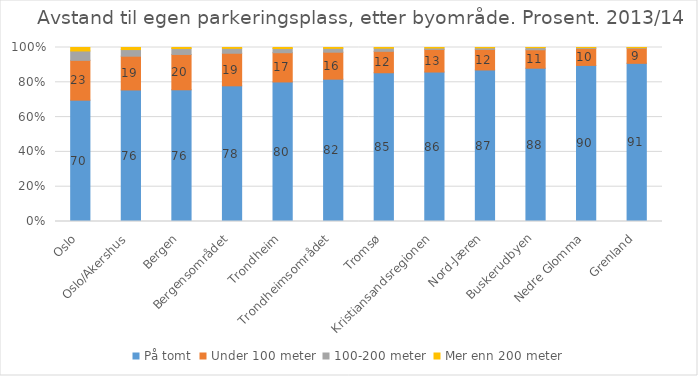
| Category | På tomt | Under 100 meter | 100-200 meter | Mer enn 200 meter |
|---|---|---|---|---|
| Oslo | 69.8 | 22.9 | 5.4 | 2 |
| Oslo/Akershus | 75.6 | 19.4 | 3.8 | 1.2 |
| Bergen | 75.7 | 20.3 | 3.4 | 0.6 |
| Bergensområdet | 77.9 | 18.7 | 2.8 | 0.5 |
| Trondheim | 80.2 | 16.8 | 2.4 | 0.6 |
| Trondheimsområdet | 81.8 | 15.5 | 2.2 | 0.5 |
| Tromsø | 85.4 | 12.3 | 1.8 | 0.4 |
| Kristiansandsregionen | 85.9 | 13 | 0.8 | 0.3 |
| Nord-Jæren | 87 | 11.8 | 0.9 | 0.2 |
| Buskerudbyen | 88.2 | 10.6 | 1.2 | 0.1 |
| Nedre Glomma | 89.8 | 9.7 | 0.5 | 0.1 |
| Grenland | 90.9 | 8.7 | 0.3 | 0.1 |